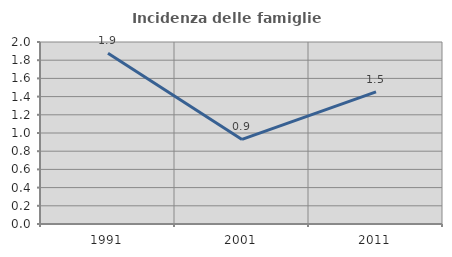
| Category | Incidenza delle famiglie numerose |
|---|---|
| 1991.0 | 1.877 |
| 2001.0 | 0.929 |
| 2011.0 | 1.452 |